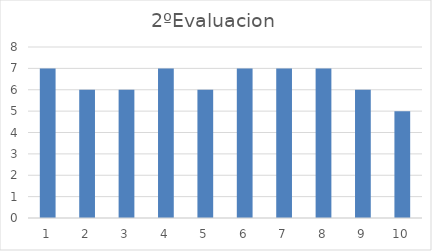
| Category | Series 0 |
|---|---|
| 0 | 7 |
| 1 | 6 |
| 2 | 6 |
| 3 | 7 |
| 4 | 6 |
| 5 | 7 |
| 6 | 7 |
| 7 | 7 |
| 8 | 6 |
| 9 | 5 |